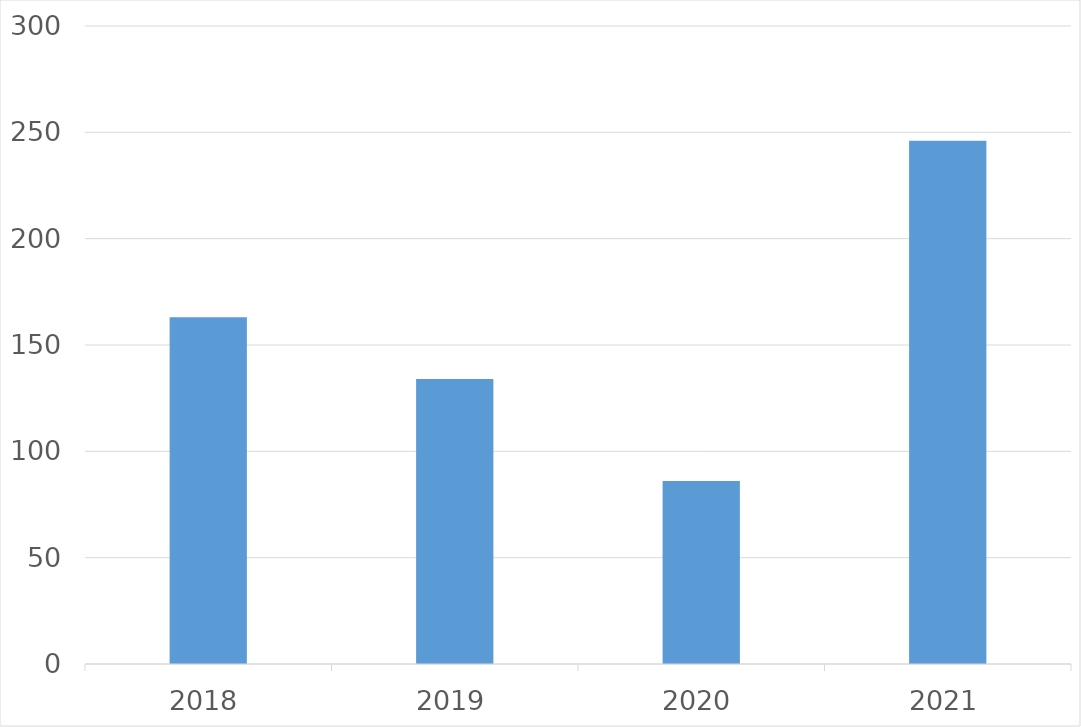
| Category | Series 0 |
|---|---|
| 2018 | 163 |
| 2019 | 134 |
| 2020 | 86 |
| 2021 | 246 |